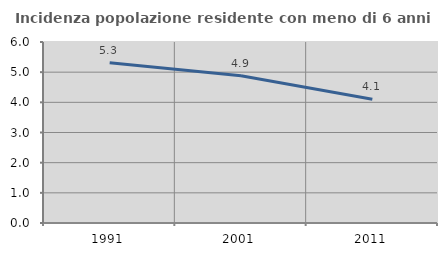
| Category | Incidenza popolazione residente con meno di 6 anni |
|---|---|
| 1991.0 | 5.309 |
| 2001.0 | 4.881 |
| 2011.0 | 4.106 |